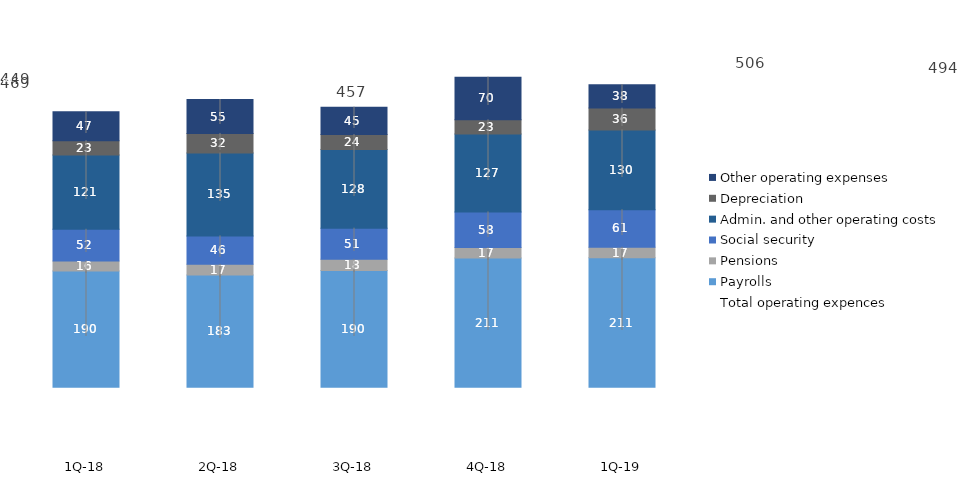
| Category | Payrolls | Pensions | Social security | Admin. and other operating costs | Depreciation | Other operating expenses |
|---|---|---|---|---|---|---|
| 1Q-19 | 211.174 | 17.185 | 61.24 | 130.252 | 35.543 | 38.331 |
| 4Q-18 | 210.902 | 16.926 | 58.219 | 127.179 | 23.057 | 69.672 |
| 3Q-18 | 190.273 | 18.438 | 50.778 | 128.41 | 24.363 | 44.712 |
| 2Q-18 | 183.153 | 17.319 | 46.468 | 135.219 | 31.886 | 55.331 |
| 1Q-18 | 189.7 | 16.4 | 51.6 | 121.4 | 23.2 | 47.1 |